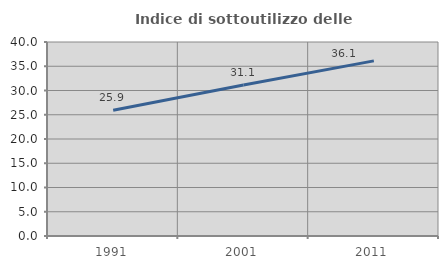
| Category | Indice di sottoutilizzo delle abitazioni  |
|---|---|
| 1991.0 | 25.918 |
| 2001.0 | 31.116 |
| 2011.0 | 36.111 |